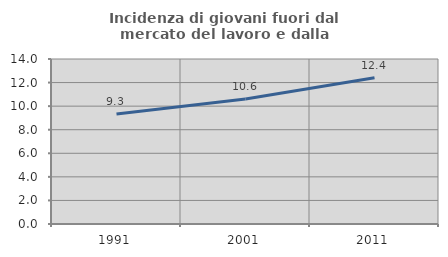
| Category | Incidenza di giovani fuori dal mercato del lavoro e dalla formazione  |
|---|---|
| 1991.0 | 9.339 |
| 2001.0 | 10.599 |
| 2011.0 | 12.405 |